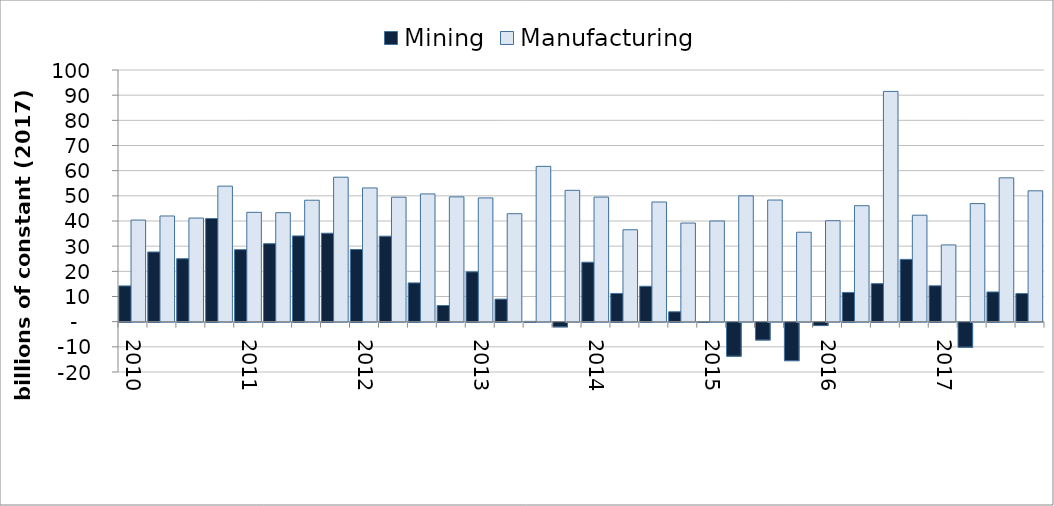
| Category | Mining | Manufacturing |
|---|---|---|
| 2010.0 | 14.196 | 40.371 |
| nan | 27.677 | 41.993 |
| nan | 25.016 | 41.161 |
| nan | 41.006 | 53.85 |
| 2011.0 | 28.614 | 43.448 |
| nan | 30.987 | 43.314 |
| nan | 34.076 | 48.257 |
| nan | 35.141 | 57.407 |
| 2012.0 | 28.673 | 53.136 |
| nan | 33.955 | 49.461 |
| nan | 15.397 | 50.758 |
| nan | 6.426 | 49.596 |
| 2013.0 | 19.791 | 49.173 |
| nan | 8.954 | 42.898 |
| nan | 0.122 | 61.705 |
| nan | -1.845 | 52.19 |
| 2014.0 | 23.616 | 49.501 |
| nan | 11.206 | 36.528 |
| nan | 14.07 | 47.544 |
| nan | 3.927 | 39.19 |
| 2015.0 | -0.118 | 39.997 |
| nan | -13.497 | 49.98 |
| nan | -7.05 | 48.329 |
| nan | -15.286 | 35.542 |
| 2016.0 | -1.344 | 40.117 |
| nan | 11.606 | 46.074 |
| nan | 15.104 | 91.493 |
| nan | 24.755 | 42.305 |
| 2017.0 | 14.247 | 30.497 |
| nan | -9.917 | 46.913 |
| nan | 11.796 | 57.144 |
| nan | 11.156 | 51.995 |